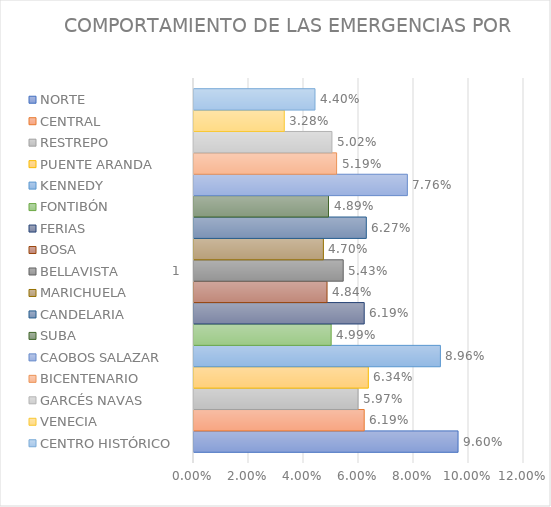
| Category | NORTE | CENTRAL | RESTREPO | PUENTE ARANDA | KENNEDY | FONTIBÓN | FERIAS | BOSA | BELLAVISTA | MARICHUELA | CANDELARIA | SUBA | CAOBOS SALAZAR | BICENTENARIO | GARCÉS NAVAS | VENECIA | CENTRO HISTÓRICO |
|---|---|---|---|---|---|---|---|---|---|---|---|---|---|---|---|---|---|
| 0 | 0.096 | 0.062 | 0.06 | 0.063 | 0.09 | 0.05 | 0.062 | 0.048 | 0.054 | 0.047 | 0.063 | 0.049 | 0.078 | 0.052 | 0.05 | 0.033 | 0.044 |